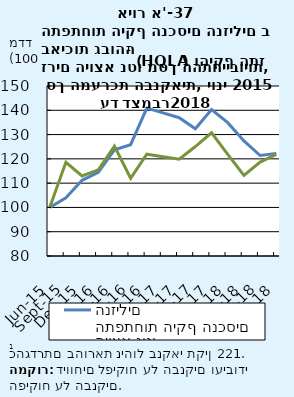
| Category | התפתחות היקף הנכסים הנזילים | התפתחות היקף התזרים היוצא נטו |
|---|---|---|
| 2015-06-30 | 100 | 100 |
| 2015-09-30 | 103.978 | 118.577 |
| 2015-12-31 | 111.172 | 112.973 |
| 2016-03-31 | 114.424 | 115.47 |
| 2016-06-30 | 123.728 | 125.246 |
| 2016-09-30 | 125.821 | 112.012 |
| 2016-12-31 | 140.907 | 121.921 |
| 2017-03-31 | 138.914 | 120.877 |
| 2017-06-30 | 136.95 | 119.843 |
| 2017-09-30 | 132.383 | 125.08 |
| 2017-12-31 | 140.333 | 130.744 |
| 2018-03-31 | 134.906 | 121.878 |
| 2018-06-30 | 127.394 | 113.197 |
| 2018-09-30 | 121.367 | 118.682 |
| 2018-12-31 | 122.26 | 121.809 |